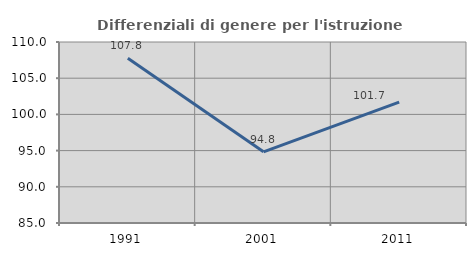
| Category | Differenziali di genere per l'istruzione superiore |
|---|---|
| 1991.0 | 107.761 |
| 2001.0 | 94.827 |
| 2011.0 | 101.701 |